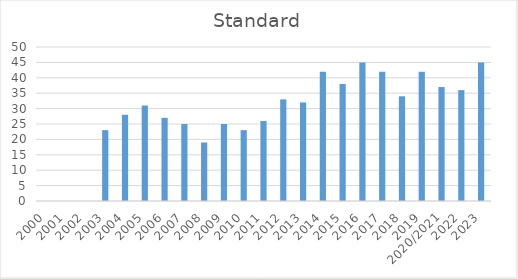
| Category | Standard |
|---|---|
| 2000 | 0 |
| 2001 | 0 |
| 2002 | 0 |
| 2003 | 23 |
| 2004 | 28 |
| 2005 | 31 |
| 2006 | 27 |
| 2007 | 25 |
| 2008 | 19 |
| 2009 | 25 |
| 2010 | 23 |
| 2011 | 26 |
| 2012 | 33 |
| 2013 | 32 |
| 2014 | 42 |
| 2015 | 38 |
| 2016 | 45 |
| 2017 | 42 |
| 2018 | 34 |
| 2019 | 42 |
| 2020/2021 | 37 |
| 2022 | 36 |
| 2023 | 45 |